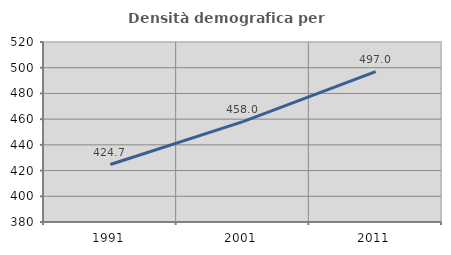
| Category | Densità demografica |
|---|---|
| 1991.0 | 424.69 |
| 2001.0 | 458.023 |
| 2011.0 | 496.951 |